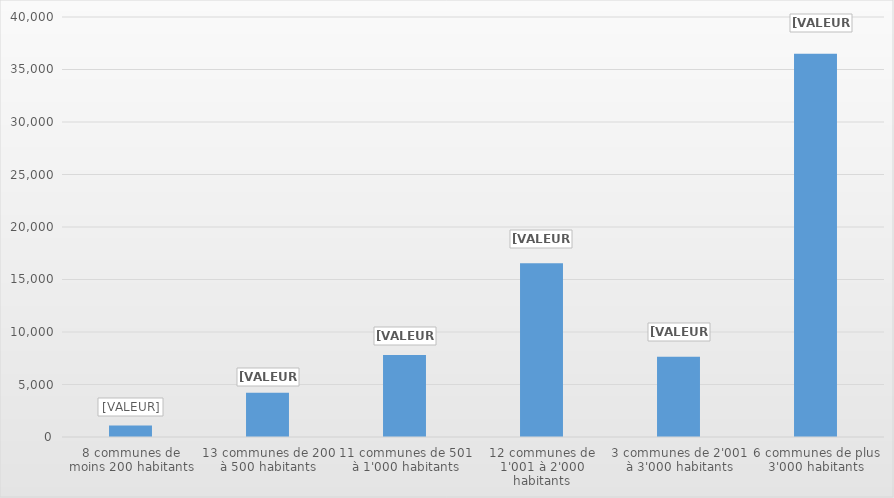
| Category | Series 0 |
|---|---|
| 8 communes de moins 200 habitants | 1087 |
| 13 communes de 200 à 500 habitants | 4215 |
| 11 communes de 501 à 1'000 habitants | 7803 |
| 12 communes de 1'001 à 2'000 habitants | 16541 |
| 3 communes de 2'001 à 3'000 habitants | 7644 |
| 6 communes de plus 3'000 habitants | 36508 |